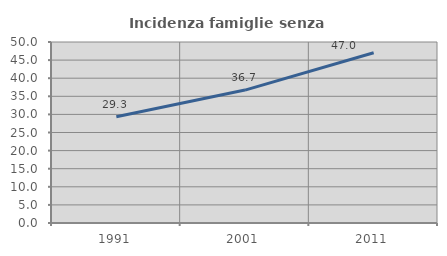
| Category | Incidenza famiglie senza nuclei |
|---|---|
| 1991.0 | 29.333 |
| 2001.0 | 36.717 |
| 2011.0 | 47.025 |